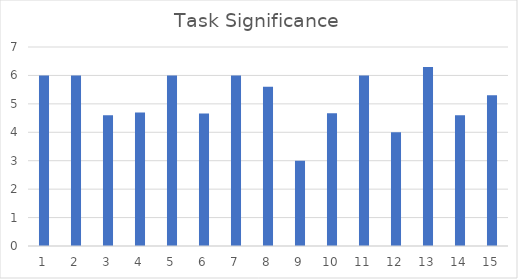
| Category | Task Significance |
|---|---|
| 0 | 6 |
| 1 | 6 |
| 2 | 4.6 |
| 3 | 4.7 |
| 4 | 6 |
| 5 | 4.66 |
| 6 | 6 |
| 7 | 5.6 |
| 8 | 3 |
| 9 | 4.67 |
| 10 | 6 |
| 11 | 4 |
| 12 | 6.3 |
| 13 | 4.6 |
| 14 | 5.3 |